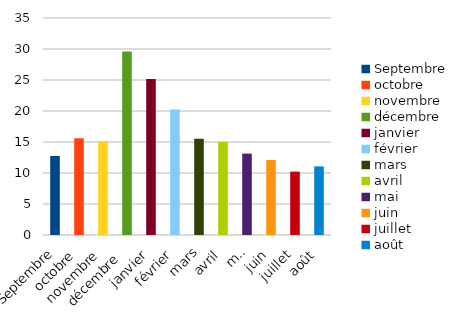
| Category | PM₂ˏ₅ |
|---|---|
| Septembre | 12.743 |
| octobre | 15.62 |
| novembre | 15.105 |
| décembre  | 29.597 |
| janvier | 25.161 |
| février | 20.243 |
| mars | 15.519 |
| avril  | 14.994 |
| mai | 13.13 |
| juin | 12.093 |
| juillet | 10.223 |
| août | 11.069 |